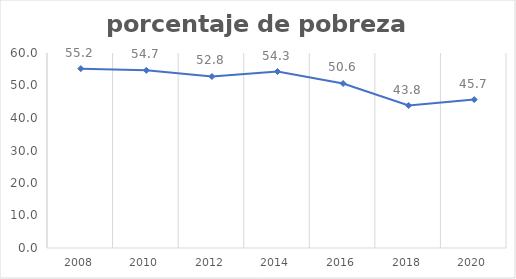
| Category | Series 0 |
|---|---|
| 2008.0 | 55.182 |
| 2010.0 | 54.668 |
| 2012.0 | 52.773 |
| 2014.0 | 54.304 |
| 2016.0 | 50.62 |
| 2018.0 | 43.845 |
| 2020.0 | 45.663 |